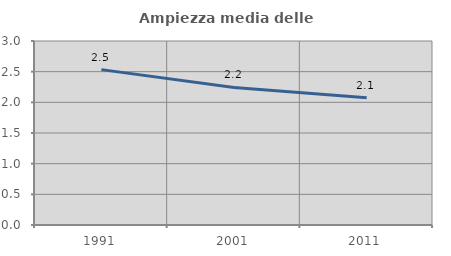
| Category | Ampiezza media delle famiglie |
|---|---|
| 1991.0 | 2.533 |
| 2001.0 | 2.243 |
| 2011.0 | 2.075 |